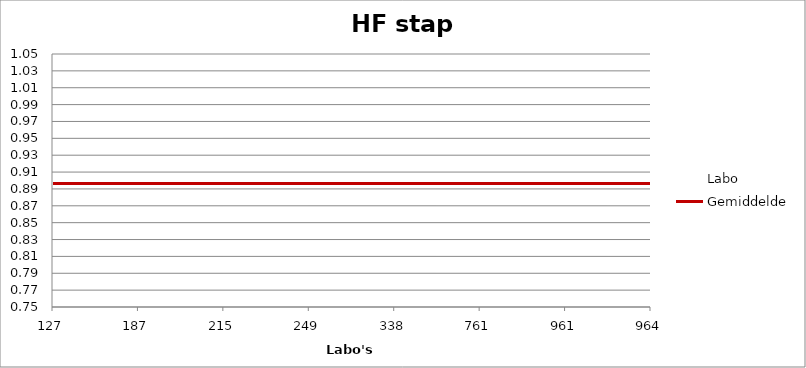
| Category | Labo | Gemiddelde |
|---|---|---|
| 127.0 | 0.853 | 0.897 |
| 187.0 | 0.853 | 0.897 |
| 215.0 | 0.95 | 0.897 |
| 249.0 | 0.422 | 0.897 |
| 338.0 | 0.969 | 0.897 |
| 761.0 | 0.891 | 0.897 |
| 961.0 | 0.876 | 0.897 |
| 964.0 | 1.027 | 0.897 |